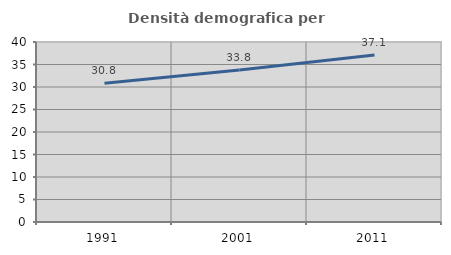
| Category | Densità demografica |
|---|---|
| 1991.0 | 30.814 |
| 2001.0 | 33.76 |
| 2011.0 | 37.131 |